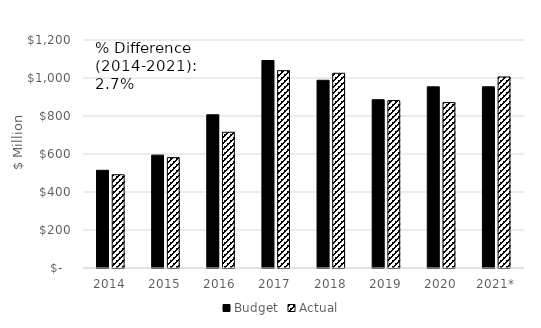
| Category | Budget | Actual |
|---|---|---|
| 2014 | 514.278 | 490.844 |
| 2015 | 594 | 580.718 |
| 2016 | 806.648 | 714.293 |
| 2017 | 1092.086 | 1038.733 |
| 2018 | 988.089 | 1024.784 |
| 2019 | 885.623 | 881.257 |
| 2020 | 953.572 | 870.47 |
| 2021* | 953.941 | 1005.563 |